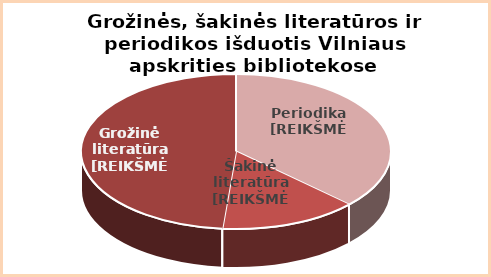
| Category | Series 0 |
|---|---|
| Periodika | 0.37 |
| Šakinė | 0.144 |
| Grožinė | 0.486 |